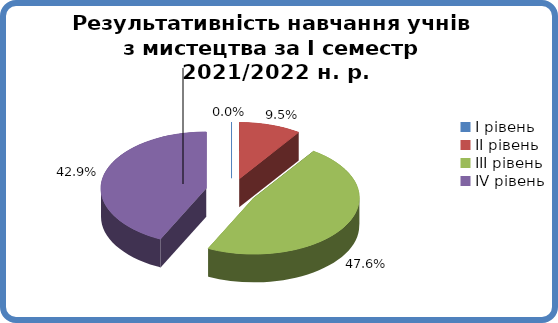
| Category | Series 0 |
|---|---|
| 0 | 0 |
| 1 | 0.095 |
| 2 | 0.476 |
| 3 | 0.429 |